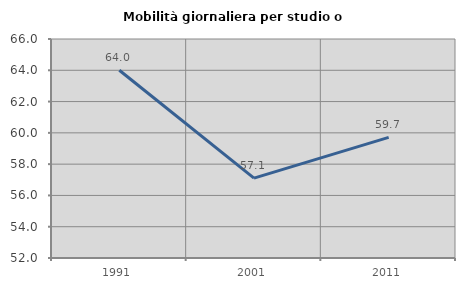
| Category | Mobilità giornaliera per studio o lavoro |
|---|---|
| 1991.0 | 64 |
| 2001.0 | 57.107 |
| 2011.0 | 59.709 |